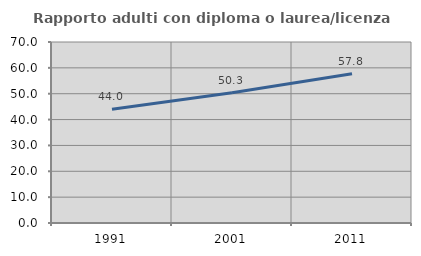
| Category | Rapporto adulti con diploma o laurea/licenza media  |
|---|---|
| 1991.0 | 44.034 |
| 2001.0 | 50.339 |
| 2011.0 | 57.76 |